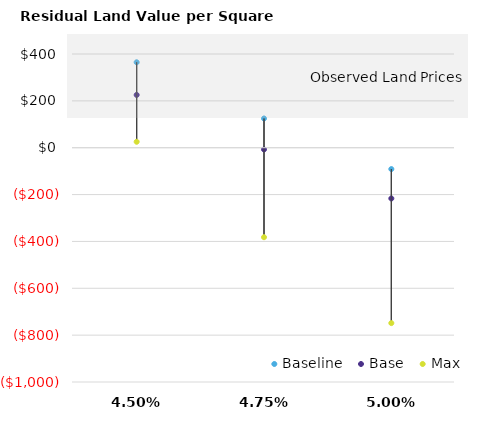
| Category | Baseline | Base | Max |
|---|---|---|---|
| 0.045 | 364.622 | 225.301 | 25.382 |
| 0.0475 | 124.735 | -7.254 | -381.967 |
| 0.05 | -91.163 | -216.552 | -748.581 |